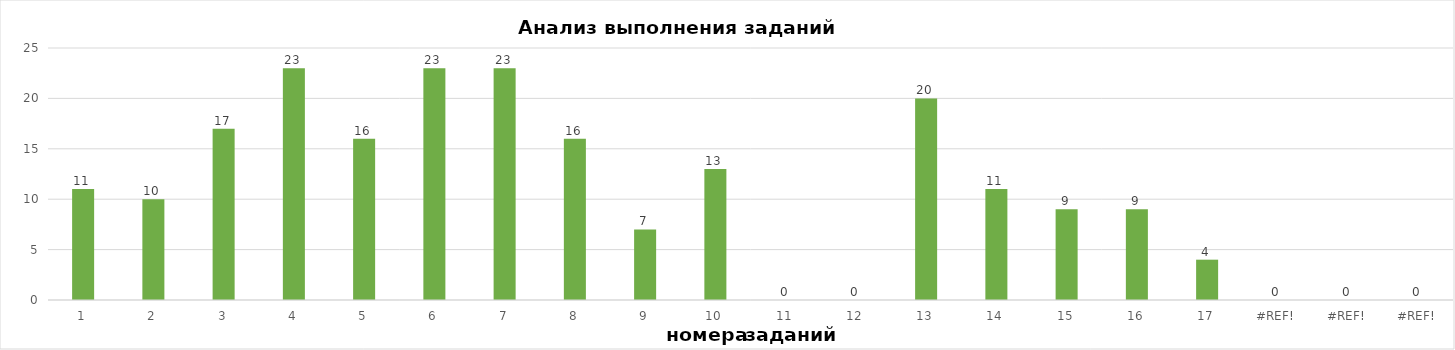
| Category | задания |
|---|---|
| 1.0 | 11 |
| 2.0 | 10 |
| 3.0 | 17 |
| 4.0 | 23 |
| 5.0 | 16 |
| 6.0 | 23 |
| 7.0 | 23 |
| 8.0 | 16 |
| 9.0 | 7 |
| 10.0 | 13 |
| 11.0 | 0 |
| 12.0 | 0 |
| 13.0 | 20 |
| 14.0 | 11 |
| 15.0 | 9 |
| 16.0 | 9 |
| 17.0 | 4 |
| 0.0 | 0 |
| 0.0 | 0 |
| 0.0 | 0 |